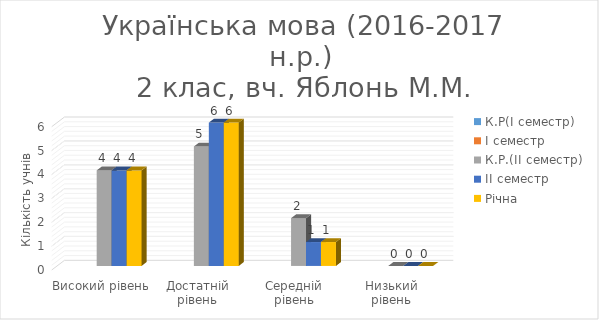
| Category | К.Р(І семестр) | І семестр | К.Р.(ІІ семестр) | ІІ семестр | Річна |
|---|---|---|---|---|---|
| Високий рівень |  |  | 4 | 4 | 4 |
| Достатній рівень |  |  | 5 | 6 | 6 |
| Середній рівень |  |  | 2 | 1 | 1 |
| Низький рівень |  |  | 0 | 0 | 0 |